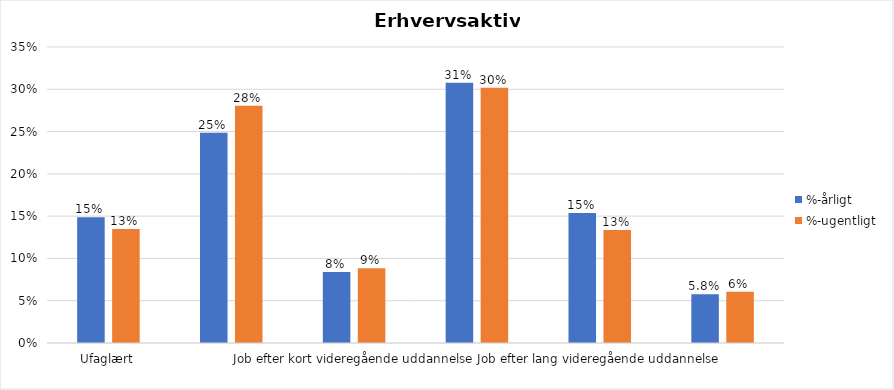
| Category | %-årligt | %-ugentligt |
|---|---|---|
| Ufaglært | 0.149 | 0.135 |
| Erhvervsfagligt job | 0.249 | 0.281 |
| Job efter kort videregående uddannelse | 0.084 | 0.088 |
| Job efter mellemlang videregående uddannelse | 0.308 | 0.302 |
| Job efter lang videregående uddannelse | 0.154 | 0.134 |
| Selvstændig | 0.058 | 0.061 |